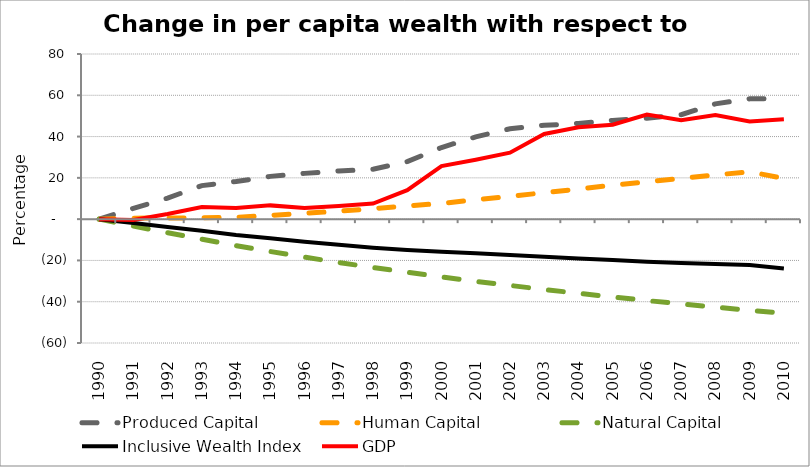
| Category | Produced Capital  | Human Capital | Natural Capital | Inclusive Wealth Index | GDP |
|---|---|---|---|---|---|
| 1990.0 | 0 | 0 | 0 | 0 | 0 |
| 1991.0 | 5.229 | 0.444 | -3.342 | -1.911 | -0.381 |
| 1992.0 | 10.206 | 0.575 | -6.573 | -3.831 | 2.519 |
| 1993.0 | 16.256 | 0.622 | -9.677 | -5.604 | 5.874 |
| 1994.0 | 18.241 | 0.866 | -12.806 | -7.634 | 5.346 |
| 1995.0 | 20.714 | 1.828 | -15.673 | -9.285 | 6.667 |
| 1996.0 | 22.17 | 2.839 | -18.408 | -10.902 | 5.435 |
| 1997.0 | 23.338 | 3.879 | -20.983 | -12.42 | 6.382 |
| 1998.0 | 24.145 | 5.118 | -23.44 | -13.834 | 7.534 |
| 1999.0 | 27.896 | 6.389 | -25.733 | -14.921 | 14.056 |
| 2000.0 | 34.7 | 7.634 | -27.988 | -15.775 | 25.683 |
| 2001.0 | 39.874 | 9.365 | -30.129 | -16.553 | 28.773 |
| 2002.0 | 43.762 | 11.079 | -32.112 | -17.313 | 32.196 |
| 2003.0 | 45.468 | 12.806 | -34.068 | -18.202 | 41.262 |
| 2004.0 | 46.345 | 14.599 | -35.938 | -19.073 | 44.527 |
| 2005.0 | 47.795 | 16.46 | -37.726 | -19.831 | 45.745 |
| 2006.0 | 48.915 | 18.112 | -39.438 | -20.604 | 50.672 |
| 2007.0 | 50.59 | 19.755 | -41.079 | -21.29 | 47.949 |
| 2008.0 | 55.838 | 21.393 | -42.658 | -21.685 | 50.392 |
| 2009.0 | 58.27 | 22.972 | -44.129 | -22.212 | 47.321 |
| 2010.0 | 58.291 | 19.706 | -45.572 | -23.955 | 48.336 |